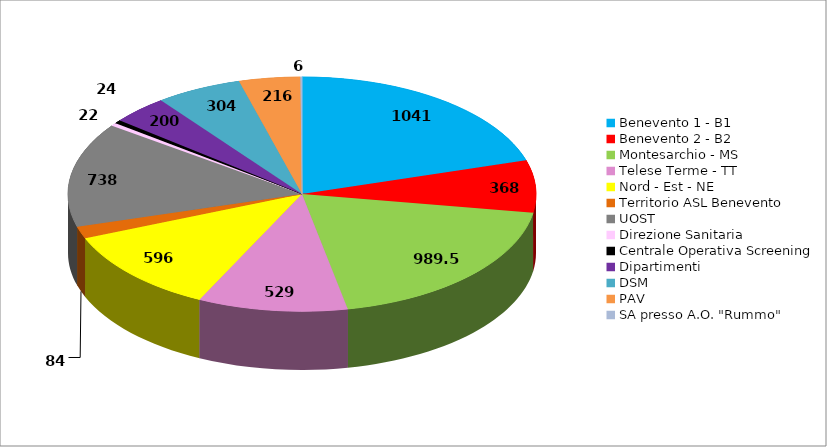
| Category | Series 0 |
|---|---|
| Benevento 1 - B1 | 1041 |
| Benevento 2 - B2 | 368 |
| Montesarchio - MS | 989.5 |
| Telese Terme - TT | 529 |
| Nord - Est - NE | 596 |
| Territorio ASL Benevento | 84 |
| UOST | 738 |
| Direzione Sanitaria | 22 |
| Centrale Operativa Screening | 24 |
| Dipartimenti | 200 |
| DSM | 304 |
| PAV | 216 |
| SA presso A.O. "Rummo" | 6 |